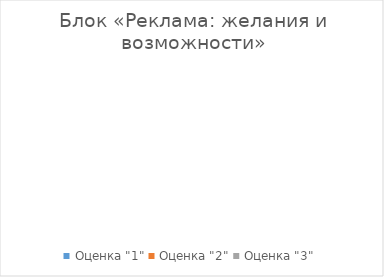
| Category | Series 0 |
|---|---|
| Оценка "1" | 0 |
| Оценка "2" | 0 |
| Оценка "3" | 0 |